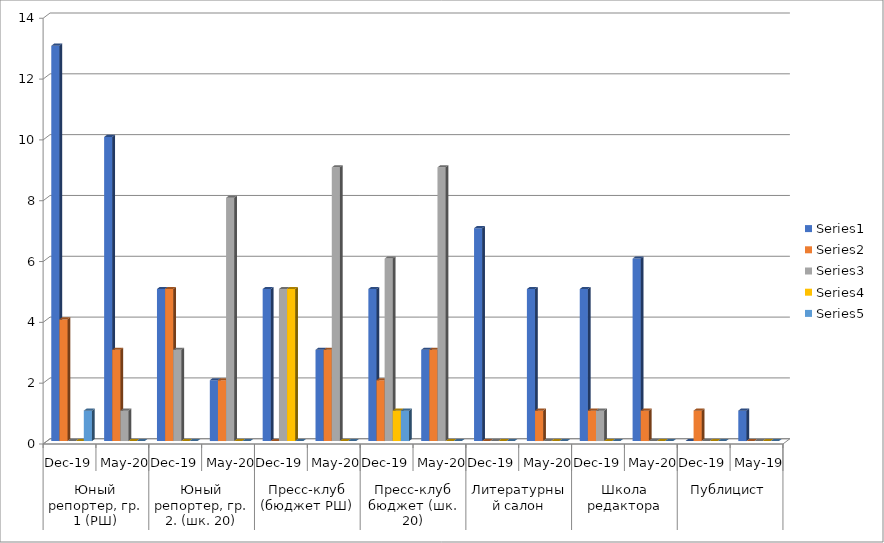
| Category | Series 0 | Series 1 | Series 2 | Series 3 | Series 4 |
|---|---|---|---|---|---|
| 0 | 13 | 4 | 0 | 0 | 1 |
| 1 | 10 | 3 | 1 | 0 | 0 |
| 2 | 5 | 5 | 3 | 0 | 0 |
| 3 | 2 | 2 | 8 | 0 | 0 |
| 4 | 5 | 0 | 5 | 5 | 0 |
| 5 | 3 | 3 | 9 | 0 | 0 |
| 6 | 5 | 2 | 6 | 1 | 1 |
| 7 | 3 | 3 | 9 | 0 | 0 |
| 8 | 7 | 0 | 0 | 0 | 0 |
| 9 | 5 | 1 | 0 | 0 | 0 |
| 10 | 5 | 1 | 1 | 0 | 0 |
| 11 | 6 | 1 | 0 | 0 | 0 |
| 12 | 0 | 1 | 0 | 0 | 0 |
| 13 | 1 | 0 | 0 | 0 | 0 |